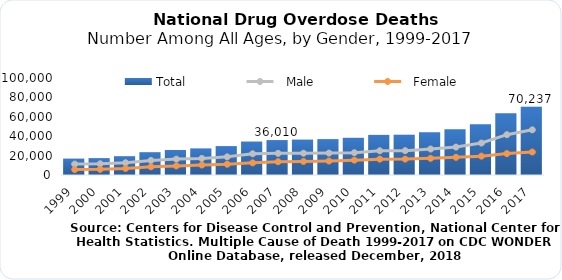
| Category | Total |
|---|---|
| 1999.0 | 16849 |
| 2000.0 | 17415 |
| 2001.0 | 19394 |
| 2002.0 | 23518 |
| 2003.0 | 25785 |
| 2004.0 | 27424 |
| 2005.0 | 29813 |
| 2006.0 | 34425 |
| 2007.0 | 36010 |
| 2008.0 | 36450 |
| 2009.0 | 37004 |
| 2010.0 | 38329 |
| 2011.0 | 41340 |
| 2012.0 | 41502 |
| 2013.0 | 43982 |
| 2014.0 | 47055 |
| 2015.0 | 52404 |
| 2016.0 | 63632 |
| 2017.0 | 70237 |